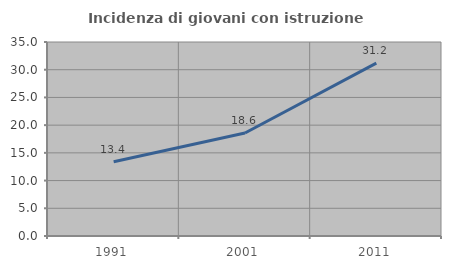
| Category | Incidenza di giovani con istruzione universitaria |
|---|---|
| 1991.0 | 13.403 |
| 2001.0 | 18.583 |
| 2011.0 | 31.181 |